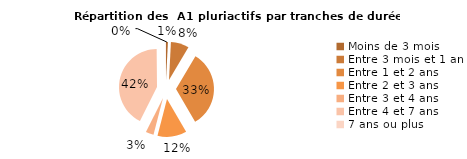
| Category | Series 0 |
|---|---|
| Moins de 3 mois | 308 |
| Entre 3 mois et 1 an | 2941 |
| Entre 1 et 2 ans | 12568 |
| Entre 2 et 3 ans | 4718 |
| Entre 3 et 4 ans | 1286 |
| Entre 4 et 7 ans | 16131 |
| 7 ans ou plus | 57 |